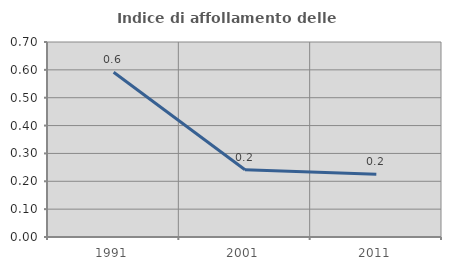
| Category | Indice di affollamento delle abitazioni  |
|---|---|
| 1991.0 | 0.591 |
| 2001.0 | 0.241 |
| 2011.0 | 0.226 |